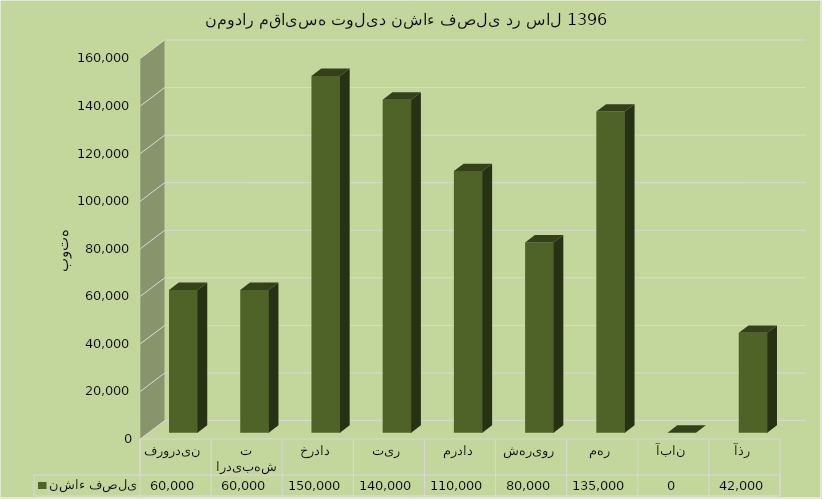
| Category | نشاء فصلی |
|---|---|
| فروردین | 60000 |
| اردیبهشت | 60000 |
| خرداد | 150000 |
| تیر | 140000 |
| مرداد | 110000 |
| شهریور | 80000 |
| مهر | 135000 |
| آبان | 0 |
| آذر | 42000 |